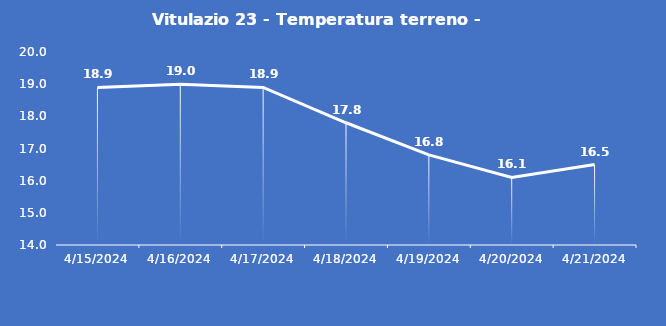
| Category | Vitulazio 23 - Temperatura terreno - Grezzo (°C) |
|---|---|
| 4/15/24 | 18.9 |
| 4/16/24 | 19 |
| 4/17/24 | 18.9 |
| 4/18/24 | 17.8 |
| 4/19/24 | 16.8 |
| 4/20/24 | 16.1 |
| 4/21/24 | 16.5 |